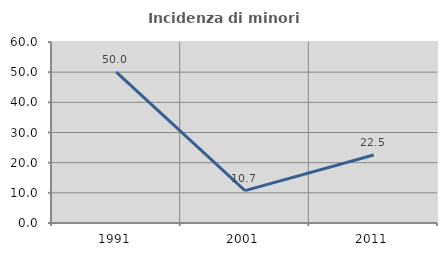
| Category | Incidenza di minori stranieri |
|---|---|
| 1991.0 | 50 |
| 2001.0 | 10.714 |
| 2011.0 | 22.535 |